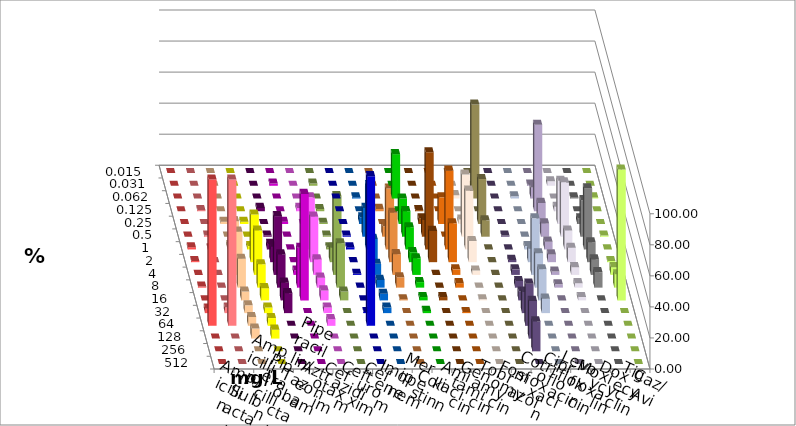
| Category | Ampicillin | Ampicillin/ Sulbactam | Piperacillin | Piperacillin/ Tazobactam | Aztreonam | Cefotaxim | Ceftazidim | Cefuroxim | Imipenem | Meropenem | Colistin | Amikacin | Gentamicin | Tobramycin | Fosfomycin | Cotrimoxazol | Ciprofloxacin | Levofloxacin | Moxifloxacin | Doxycyclin | Tigecyclin | Caz/Avi |
|---|---|---|---|---|---|---|---|---|---|---|---|---|---|---|---|---|---|---|---|---|---|---|
| 0.015 | 0 | 0 | 0 | 0 | 0 | 0 | 0 | 0 | 0 | 0 | 0 | 0 | 0 | 0 | 0 | 0 | 0 | 0 | 0 | 0 | 0 | 0 |
| 0.031 | 0 | 0 | 0 | 0 | 0 | 1.429 | 0 | 0 | 0 | 0 | 0 | 0 | 0 | 0 | 0 | 0 | 0.714 | 2.857 | 0 | 0 | 1.429 | 0 |
| 0.062 | 0 | 0 | 0 | 0 | 0 | 0 | 0 | 0 | 0.714 | 28.571 | 0 | 0 | 2.143 | 60.526 | 0 | 1.429 | 7.143 | 0 | 0.714 | 0.714 | 0 | 0 |
| 0.125 | 0 | 0.714 | 0 | 0 | 2.143 | 0 | 2.143 | 0 | 0 | 0 | 0.719 | 0 | 0 | 0 | 0 | 0 | 55.714 | 2.857 | 0 | 0 | 1.429 | 1.481 |
| 0.25 | 0 | 0 | 1.429 | 1.429 | 0 | 1.429 | 0 | 0 | 4.286 | 16.429 | 3.597 | 17.143 | 2.857 | 28.947 | 0 | 0 | 13.571 | 27.857 | 3.571 | 0 | 0.714 | 0 |
| 0.5 | 0 | 0.714 | 0 | 0 | 0.714 | 0 | 4.286 | 0.714 | 18.571 | 16.429 | 10.791 | 0 | 40 | 10.526 | 0.714 | 0 | 8.571 | 35 | 23.571 | 0.714 | 0.714 | 6.667 |
| 1.0 | 1.429 | 0.714 | 2.857 | 2.143 | 3.571 | 0 | 33.571 | 1.429 | 41.429 | 14.286 | 62.59 | 50.714 | 37.857 | 0 | 0 | 2.143 | 5 | 12.143 | 39.286 | 0 | 1.429 | 39.259 |
| 2.0 | 0.714 | 0 | 26.429 | 30.714 | 10 | 0 | 29.286 | 0 | 15 | 6.429 | 20.144 | 25 | 13.571 | 0 | 1.429 | 8.571 | 5 | 9.286 | 12.857 | 0.714 | 9.286 | 31.852 |
| 4.0 | 0 | 0 | 27.857 | 28.571 | 37.857 | 2.857 | 10 | 0.714 | 7.143 | 10.714 | 0 | 3.571 | 2.857 | 0 | 3.571 | 36.429 | 2.143 | 5 | 10 | 5 | 50.714 | 13.333 |
| 8.0 | 0.714 | 0 | 18.571 | 15 | 21.429 | 25.714 | 6.429 | 0 | 5 | 3.571 | 0 | 2.857 | 0 | 0 | 4.286 | 22.143 | 2.143 | 2.857 | 10 | 8.571 | 28.571 | 6.667 |
| 16.0 | 0 | 0 | 5.714 | 7.857 | 11.429 | 68.571 | 6.429 | 0 | 4.286 | 2.143 | 2.158 | 0 | 0.714 | 0 | 5.714 | 20 | 0 | 2.143 | 0 | 84.286 | 5.714 | 0.741 |
| 32.0 | 2.857 | 3.571 | 5 | 3.571 | 12.857 | 0 | 3.571 | 0.714 | 3.571 | 1.429 | 0 | 0.714 | 0 | 0 | 13.571 | 9.286 | 0 | 0 | 0 | 0 | 0 | 0 |
| 64.0 | 94.286 | 94.286 | 5.714 | 5 | 0 | 0 | 4.286 | 96.429 | 0 | 0 | 0 | 0 | 0 | 0 | 27.143 | 0 | 0 | 0 | 0 | 0 | 0 | 0 |
| 128.0 | 0 | 0 | 6.429 | 5.714 | 0 | 0 | 0 | 0 | 0 | 0 | 0 | 0 | 0 | 0 | 24.286 | 0 | 0 | 0 | 0 | 0 | 0 | 0 |
| 256.0 | 0 | 0 | 0 | 0 | 0 | 0 | 0 | 0 | 0 | 0 | 0 | 0 | 0 | 0 | 19.286 | 0 | 0 | 0 | 0 | 0 | 0 | 0 |
| 512.0 | 0 | 0 | 0 | 0 | 0 | 0 | 0 | 0 | 0 | 0 | 0 | 0 | 0 | 0 | 0 | 0 | 0 | 0 | 0 | 0 | 0 | 0 |